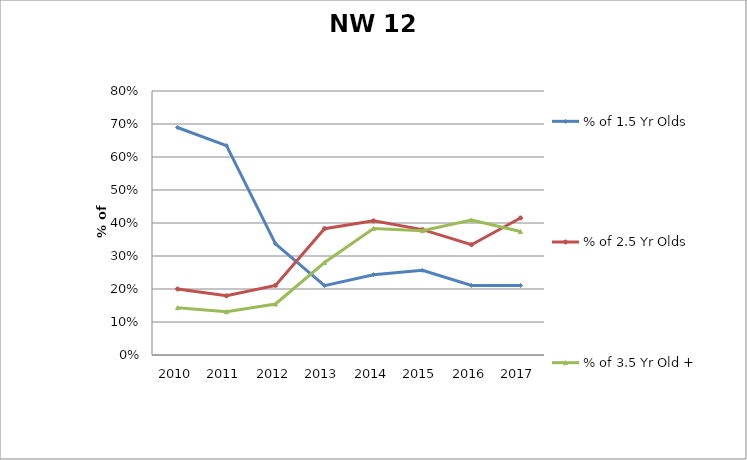
| Category | % of 1.5 Yr Olds | % of 2.5 Yr Olds | % of 3.5 Yr Old + |
|---|---|---|---|
| 2010.0 | 0.689 | 0.2 | 0.143 |
| 2011.0 | 0.635 | 0.179 | 0.131 |
| 2012.0 | 0.337 | 0.211 | 0.155 |
| 2013.0 | 0.21 | 0.383 | 0.28 |
| 2014.0 | 0.243 | 0.406 | 0.383 |
| 2015.0 | 0.256 | 0.38 | 0.377 |
| 2016.0 | 0.211 | 0.334 | 0.409 |
| 2017.0 | 0.211 | 0.415 | 0.374 |